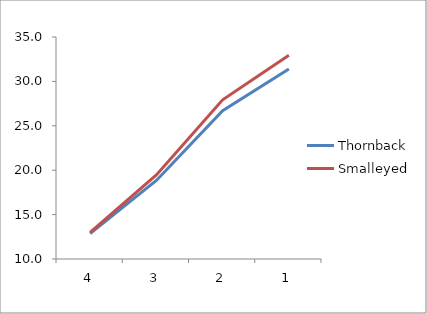
| Category | Thornback | Smalleyed |
|---|---|---|
| 0 | 12.869 | 12.988 |
| 1 | 18.841 | 19.474 |
| 2 | 26.702 | 27.926 |
| 3 | 31.408 | 32.952 |